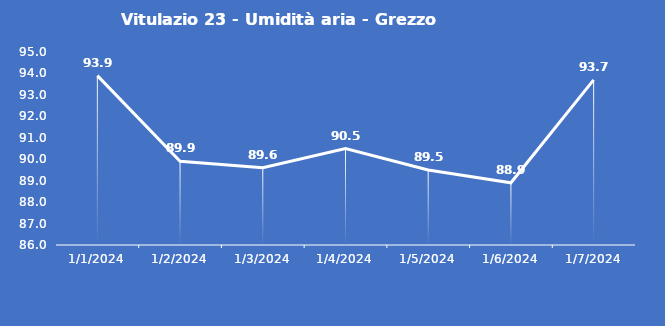
| Category | Vitulazio 23 - Umidità aria - Grezzo (%) |
|---|---|
| 1/1/24 | 93.9 |
| 1/2/24 | 89.9 |
| 1/3/24 | 89.6 |
| 1/4/24 | 90.5 |
| 1/5/24 | 89.5 |
| 1/6/24 | 88.9 |
| 1/7/24 | 93.7 |